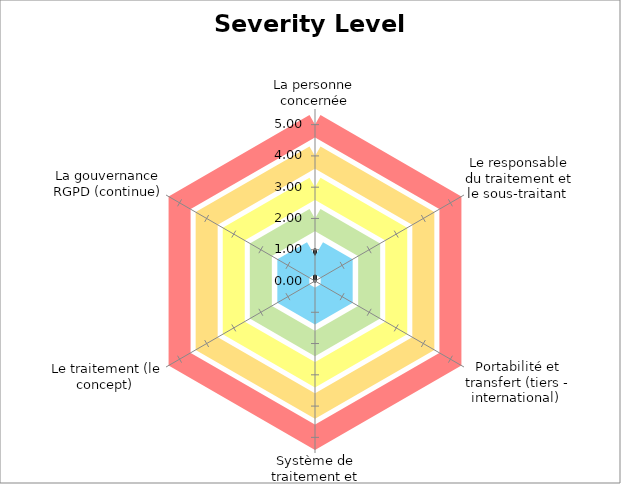
| Category | Average | Max | B | G | Y | O | R |
|---|---|---|---|---|---|---|---|
| La personne concernée | 1 | 1 | 0.8 | 2 | 3 | 4 | 5 |
| Le responsable du traitement et le sous-traitant  | 0 | 0 | 0.8 | 2 | 3 | 4 | 5 |
| Portabilité et transfert (tiers - international)  | 0 | 0 | 0.8 | 2 | 3 | 4 | 5 |
| Système de traitement et processus opérationnels (technique - business)  | 0 | 0 | 0.8 | 2 | 3 | 4 | 5 |
| Le traitement (le concept)  | 0 | 0 | 0.8 | 2 | 3 | 4 | 5 |
| La gouvernance RGPD (continue) | 0 | 0 | 0.8 | 2 | 3 | 4 | 5 |